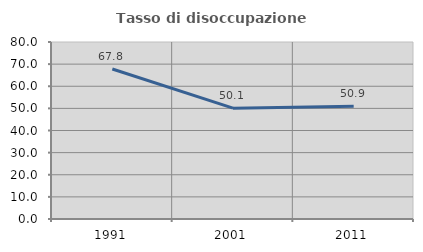
| Category | Tasso di disoccupazione giovanile  |
|---|---|
| 1991.0 | 67.793 |
| 2001.0 | 50.087 |
| 2011.0 | 50.913 |